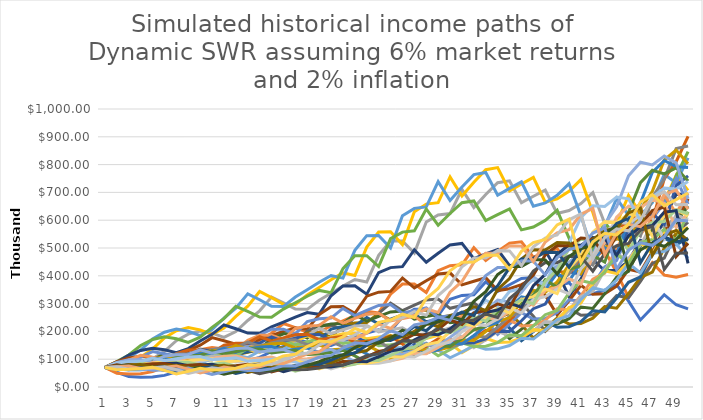
| Category | Series 0 | Series 1 | Series 2 | Series 3 | Series 4 | Series 5 | Series 6 | Series 7 | Series 8 | Series 9 | Series 10 | Series 11 | Series 12 | Series 13 | Series 14 | Series 15 | Series 16 | Series 17 | Series 18 | Series 19 | Series 20 | Series 21 | Series 22 | Series 23 | Series 24 | Series 25 | Series 26 | Series 27 | Series 28 | Series 29 | Series 30 | Series 31 | Series 32 | Series 33 | Series 34 | Series 35 | Series 36 | Series 37 | Series 38 | Series 39 |
|---|---|---|---|---|---|---|---|---|---|---|---|---|---|---|---|---|---|---|---|---|---|---|---|---|---|---|---|---|---|---|---|---|---|---|---|---|---|---|---|---|
| 0 | 70267.642 | 70267.642 | 70267.642 | 70267.642 | 70267.642 | 70267.642 | 70267.642 | 70267.642 | 70267.642 | 70267.642 | 70267.642 | 70267.642 | 70267.642 | 70267.642 | 70267.642 | 70267.642 | 70267.642 | 70267.642 | 70267.642 | 70267.642 | 70267.642 | 70267.642 | 70267.642 | 70267.642 | 70267.642 | 70267.642 | 70267.642 | 70267.642 | 70267.642 | 70267.642 | 70267.642 | 70267.642 | 70267.642 | 70267.642 | 70267.642 | 70267.642 | 70267.642 | 70267.642 | 70267.642 | 70267.642 |
| 1 | 53126.877 | 49607.112 | 66201.254 | 72033.815 | 81136.656 | 91250.923 | 88553.785 | 91304.866 | 80314.028 | 74380.325 | 67536.337 | 64791.999 | 78635.06 | 84204.65 | 80489.342 | 83024.652 | 65803.426 | 65088.684 | 70024.447 | 78554.146 | 75985.122 | 75735.637 | 74838.838 | 68689.363 | 88236.871 | 77906.833 | 70415.532 | 64529.028 | 86625.331 | 73402.612 | 70914.502 | 80219.629 | 63942.4 | 75465.923 | 74744.438 | 71096.559 | 62971.431 | 72930.613 | 72762.042 | 62148.804 |
| 2 | 37505.444 | 46735.429 | 67863.883 | 83174.384 | 105363.563 | 114995.402 | 115063.381 | 104356.958 | 85013.043 | 71487.754 | 62272.308 | 72505.956 | 94229.823 | 96451.844 | 95100.22 | 77748.434 | 60952.297 | 64862.138 | 78280.732 | 84944.205 | 81896.421 | 80660.962 | 73156.447 | 86253.291 | 97827.674 | 78069.265 | 64663.568 | 79549.254 | 90488.316 | 74076.875 | 80956.511 | 72997.109 | 68671.4 | 80272.326 | 75624.679 | 63713.025 | 65356.608 | 75518.059 | 64353.731 | 63453.22 |
| 3 | 35333.576 | 47908.185 | 78357.917 | 108007.505 | 132777.55 | 149417.502 | 131509.042 | 110460.386 | 81705.282 | 65914.369 | 69684.831 | 86883.404 | 107932.896 | 113957.961 | 89054.752 | 72015.207 | 60738.887 | 72508.253 | 84646.794 | 91550.581 | 87220.593 | 78846.053 | 91860.706 | 95626.507 | 98029.608 | 71690.612 | 79713.458 | 83094.963 | 91317.631 | 84564.945 | 73666.12 | 78394.144 | 73043.547 | 81215.983 | 67769.484 | 66124.92 | 67673.939 | 66789.88 | 65703.063 | 66293.666 |
| 4 | 36219.427 | 55315.188 | 101750.773 | 136106.427 | 172518.687 | 170769.557 | 139197.442 | 106160.175 | 75333.662 | 73758.809 | 83501.043 | 99515.969 | 127520.047 | 106711.382 | 82485.984 | 71761.493 | 67897.458 | 78403.161 | 91228.044 | 97500.246 | 85256.224 | 99002.835 | 101841.057 | 95821.8 | 90018.124 | 88374.052 | 83264.664 | 83854.684 | 104244.428 | 76947.919 | 79110.886 | 83383.491 | 73900.608 | 72778.422 | 70333.4 | 68467.994 | 59851.053 | 68188.8 | 68642.72 | 70601.941 |
| 5 | 41818.285 | 71827.243 | 128218.999 | 176839.832 | 197167.391 | 180749.064 | 133775.41 | 97879.229 | 84297.14 | 88380.714 | 95639.614 | 117572.94 | 119408.297 | 98837.96 | 82193.483 | 80217.314 | 73415.813 | 84497.02 | 97154.503 | 95302.159 | 107049.275 | 109756.618 | 102046.684 | 87988.717 | 110964.077 | 92308.951 | 84023.995 | 95722.826 | 94852.618 | 82633.339 | 84143.906 | 84359.926 | 66221.514 | 75530.096 | 72823.915 | 60551.92 | 61103.227 | 71238.027 | 73101.966 | 59729.407 |
| 6 | 54300.073 | 90509.311 | 166587.819 | 202100.989 | 208684.453 | 173704.27 | 123337.348 | 109522.588 | 101005.693 | 101226.173 | 112990.47 | 110091.254 | 110595.366 | 98485.069 | 91876.286 | 86734.846 | 79120.1 | 89984.014 | 94961.893 | 119660.215 | 118674.173 | 109975.543 | 93702.452 | 108459.808 | 115901.98 | 93148.488 | 95913.759 | 87096.636 | 101858.47 | 87888.311 | 85127.168 | 75592.148 | 68723.601 | 78202.718 | 64402.649 | 61817.248 | 63834.047 | 75864.021 | 61842.924 | 47148.711 |
| 7 | 68421.607 | 117590.682 | 190379.586 | 213900.714 | 200545.685 | 160146.554 | 138005.55 | 131227.695 | 115683.11 | 119587.451 | 105797.655 | 101963.335 | 110197.652 | 110084.261 | 99338.528 | 93471.588 | 84255.758 | 87950.959 | 119229.903 | 132651.16 | 118907.817 | 100980.371 | 115499.896 | 113283.347 | 116953.073 | 106326.663 | 87268.11 | 93527.213 | 108333.246 | 88913.034 | 76277.68 | 78446.266 | 71153.54 | 69157.669 | 65746.747 | 64578.312 | 67977.493 | 64177.915 | 48815.802 | 56628.32 |
| 8 | 88891.668 | 134381.097 | 201489.449 | 205552.895 | 184887.931 | 179187.489 | 165350.872 | 150292.649 | 136662.979 | 111971.624 | 97984.052 | 101593.888 | 123172.942 | 119022.113 | 107051.279 | 99536.077 | 82349.875 | 110424.271 | 132170.52 | 132908.69 | 109179.07 | 124467.433 | 120633.234 | 114307.57 | 133495.353 | 96739.755 | 93708.788 | 99469.684 | 109593.349 | 79667.805 | 79155.519 | 81217.762 | 62922.091 | 70599.077 | 68681.446 | 68768.189 | 57504.659 | 50657.546 | 58628.991 | 67023.189 |
| 9 | 101581.299 | 142218.975 | 193620.396 | 189498.716 | 206864.553 | 214686.657 | 189367.813 | 177544.041 | 127956.007 | 103699.046 | 97626.198 | 113552.836 | 133169.624 | 128259.408 | 113993.527 | 97281.734 | 103389.001 | 122405.628 | 132423.285 | 122030.894 | 134569.176 | 129995.567 | 121720.387 | 130471.884 | 121455.274 | 103876.465 | 99659.912 | 100623.777 | 98194.928 | 82671.156 | 81949.701 | 71819.948 | 64231.676 | 73748.232 | 73135.421 | 58171.854 | 45388.832 | 60839.212 | 69389.101 | 61486.293 |
| 10 | 107502.806 | 136660.503 | 178492.698 | 212016.891 | 247839.272 | 245861.995 | 223697.535 | 166227.385 | 118498.851 | 103317.15 | 109114.749 | 122764.987 | 143500.503 | 136572.807 | 111408.327 | 122131.974 | 114603.494 | 122635.955 | 121581.487 | 150405.138 | 140541.66 | 131163.07 | 138928.69 | 118700.853 | 130411.303 | 110469.914 | 100813.119 | 90155.484 | 101893.596 | 85586.813 | 72464.97 | 73312.473 | 67094.747 | 78528.377 | 61864.251 | 45914.045 | 54509.865 | 72002.752 | 63654.8 | 62126.99 |
| 11 | 103297.814 | 125979.019 | 199696.523 | 254003.889 | 283819.566 | 290423.861 | 209432.236 | 153936.601 | 118058.607 | 115471.646 | 117963.011 | 132284.399 | 152796.81 | 133471.197 | 139862.595 | 135375.088 | 114815.402 | 112591.802 | 149846.356 | 157075.343 | 141799.26 | 149701.464 | 126390.579 | 127449.623 | 138684.506 | 111744.569 | 90322.186 | 93548.287 | 105483.758 | 75678.664 | 73968.49 | 76577.819 | 71441.306 | 66423.916 | 48826.801 | 55138.827 | 64509.917 | 66050.308 | 64315.999 | 67671.564 |
| 12 | 95220.687 | 140939.669 | 239235.366 | 290869.073 | 335249.546 | 271893.985 | 193940.193 | 153359.393 | 131942.761 | 124831.078 | 127105.672 | 140849.227 | 149321.581 | 167554.64 | 155022.927 | 135620.711 | 105408.122 | 138761.978 | 156486.366 | 158475.408 | 161835.358 | 136186.414 | 135701.42 | 135530.25 | 140279.862 | 100112.611 | 93718.02 | 96841.057 | 93268.967 | 77246.191 | 77260.383 | 81535.893 | 60427.164 | 52423.735 | 58634.767 | 65252.006 | 59174.856 | 66734.081 | 70053.509 | 79577.047 |
| 13 | 106524.708 | 168838.755 | 273947.02 | 343563.827 | 313848.112 | 251772.279 | 193205.876 | 171388.75 | 142631.993 | 134501.096 | 135330.22 | 137640.67 | 187445.708 | 185709.802 | 155298.484 | 124504.188 | 129903.785 | 144905.482 | 157875.371 | 180861.174 | 147219.443 | 146213.506 | 144299.922 | 137084.275 | 125672.921 | 103872.712 | 97013.194 | 85623.921 | 95197.337 | 80680.985 | 82259.622 | 68962.926 | 47689.164 | 62951.91 | 69386.594 | 59853.37 | 59785.252 | 72684.629 | 82375.017 | 78550.544 |
| 14 | 127606.332 | 193328.695 | 323563.44 | 321619.027 | 290610.172 | 250809.161 | 215911.234 | 185266.405 | 153674.932 | 143198.562 | 132242.204 | 172775.707 | 207747.999 | 186032.615 | 142563.431 | 153431.548 | 135649.788 | 146185.963 | 180169.316 | 164520.522 | 158052.677 | 155471.996 | 145948.782 | 122805.269 | 130387.925 | 107520.716 | 85772.758 | 87390.802 | 99426.442 | 85898.192 | 69572.328 | 54423.461 | 57264.259 | 74492.45 | 63643.388 | 60468.396 | 65113.635 | 85465.567 | 81309.235 | 93847.329 |
| 15 | 146109.433 | 228334.236 | 302883.487 | 297793.267 | 289486.388 | 280272.286 | 233384.201 | 199601.869 | 163605.431 | 139925.156 | 165992.257 | 191481.084 | 208100.422 | 170770.112 | 175679.342 | 160211.554 | 136842.761 | 166822.248 | 163884.324 | 176619.486 | 168053.82 | 157241.945 | 130740.965 | 127407.359 | 134961.501 | 95058.853 | 87539.051 | 91269.29 | 105851.395 | 72646.668 | 54902.089 | 65347.946 | 67759.289 | 68323.771 | 64294.671 | 65854.912 | 76560.082 | 84356.274 | 97139.182 | 111236.111 |
| 16 | 172557.401 | 213731.143 | 280433.155 | 296628.469 | 323478.58 | 302940.257 | 251431.683 | 212490.692 | 159858.406 | 175628.167 | 183955.022 | 191797.353 | 191018.906 | 210428.734 | 183434.272 | 161613.323 | 156153.148 | 151736.889 | 175928.651 | 187787.106 | 169959.42 | 140851.098 | 135634.391 | 131870.503 | 119313.873 | 97012.044 | 91420.039 | 97162.79 | 89517.693 | 57325.606 | 65919.707 | 77321.053 | 62145.407 | 69019.87 | 70018.906 | 77428.214 | 75563.005 | 100774.947 | 115132.768 | 118109.511 |
| 17 | 161513.802 | 197879.519 | 279322.931 | 331443.486 | 349624.323 | 326350.901 | 267654.522 | 207614.149 | 200637.97 | 194624.39 | 184250.068 | 176045.642 | 235368.755 | 219707.106 | 185030.4 | 184410.376 | 142025.794 | 162880.693 | 187043.664 | 189907.404 | 152235.643 | 146115.957 | 140379.032 | 116575.686 | 121759.625 | 101308.176 | 97318.63 | 82165.887 | 70635.189 | 68826.286 | 77993.851 | 70911.591 | 62775.563 | 75161.209 | 82320.059 | 76416.184 | 90265.893 | 119436.304 | 122241.114 | 145599.577 |
| 18 | 149527.297 | 197086.049 | 312090.861 | 358214.699 | 376623.374 | 347389.913 | 261498.636 | 260562.792 | 222327.93 | 194926.587 | 169109.549 | 216907.985 | 245734.241 | 221607.53 | 211119.858 | 167717.987 | 152448.608 | 173162.498 | 189145.901 | 170094.711 | 157917.973 | 151219.527 | 124091.024 | 118959.23 | 127145.195 | 107839.257 | 82293.468 | 64830.83 | 84801.707 | 81428.649 | 71524.962 | 71626.976 | 68357.795 | 88361.262 | 81239.938 | 91280.417 | 106975.732 | 126803.871 | 150685.111 | 165333.306 |
| 19 | 148919.548 | 220194.534 | 337280.44 | 385855.969 | 400881.344 | 339381.555 | 328171.657 | 288715.094 | 222660.935 | 178898.929 | 208350.516 | 226448.055 | 247846.206 | 252840.535 | 191999.263 | 180016.398 | 162063.005 | 175099.121 | 169403.366 | 176433.973 | 163424.807 | 133666.381 | 126621.286 | 124214.124 | 135334.502 | 91184.801 | 64927.934 | 77828.965 | 100323.732 | 74670.781 | 72242.574 | 77992.031 | 80358.604 | 87197.094 | 97037.152 | 108172.132 | 113568.428 | 156300.996 | 171098.723 | 162171.971 |
| 20 | 166370.671 | 237952.925 | 363284.933 | 410684.403 | 391616.776 | 425886.905 | 363607.279 | 289130.497 | 204340.806 | 220398.483 | 217501.395 | 228380.808 | 282760.586 | 229927.854 | 206066.027 | 191358.123 | 163865.836 | 156813.51 | 175706.509 | 182575.728 | 144446.393 | 136383.852 | 132206.854 | 132206.854 | 114426.998 | 71938.783 | 77940.945 | 92069.281 | 91992.316 | 75415.511 | 78657.699 | 91678.813 | 79295.199 | 104146.547 | 114987.392 | 114831.793 | 139978.475 | 177464.947 | 167817.259 | 180569.567 |
| 21 | 179776.834 | 256282.955 | 386636.471 | 401167.827 | 491405.241 | 471843.775 | 364107.334 | 265324.54 | 251726.192 | 230063.918 | 219343.869 | 260536.543 | 257120.204 | 246757.788 | 219035.08 | 193474.565 | 146744.007 | 162637.891 | 181811.404 | 161363.092 | 147373.674 | 142391.034 | 140704.958 | 111775.44 | 90269.613 | 86351.446 | 92195.9 | 84418.002 | 92903.908 | 82107.183 | 92455.433 | 90459.865 | 94702.667 | 123404.076 | 122058.892 | 141526.652 | 158922.189 | 174050.343 | 186843.429 | 210547.317 |
| 22 | 193612.178 | 272737.855 | 377651.288 | 503355.547 | 544394.832 | 472460.337 | 334105.181 | 326829.305 | 262747.494 | 231996.927 | 250210.084 | 236895.19 | 275921.633 | 262269.877 | 221442.471 | 173247.151 | 152183.967 | 168277.199 | 160676.571 | 164621.928 | 153854.382 | 151533.391 | 118952.093 | 88171.806 | 108347.37 | 102137.64 | 84528.312 | 85248.701 | 101140.413 | 96503.4 | 91219.914 | 108029.289 | 112206.264 | 130984.218 | 150423.531 | 160668.886 | 155853.696 | 193769.918 | 217847.836 | 196206.387 |
| 23 | 206027.984 | 266379.88 | 473813.661 | 557592.487 | 545065.838 | 433497.887 | 411523.487 | 341113.582 | 264935.496 | 264624.095 | 227488.921 | 254198.882 | 293245.355 | 265132.826 | 198276.382 | 179656.308 | 157449.137 | 148704.652 | 163909.406 | 171848.398 | 163720.632 | 128096.975 | 93826.016 | 105821.612 | 128145.225 | 93636.301 | 85353.776 | 92799.653 | 118865.009 | 95206.737 | 108928.891 | 127986.527 | 119089.758 | 161411.016 | 170756.471 | 157555.001 | 173498.779 | 225906.965 | 202994.618 | 232603.879 |
| 24 | 201208.977 | 334182.088 | 524825.315 | 558234.952 | 500075.68 | 533904.451 | 429474.903 | 343926.563 | 302170.764 | 240574.709 | 244085.953 | 270137.059 | 296422.64 | 237377.04 | 205594.976 | 185857.032 | 139124.849 | 151684.434 | 171090.865 | 182853.876 | 138388.208 | 101031.129 | 112598.617 | 125147.9 | 117469.738 | 94543.121 | 92906.577 | 109053.799 | 117258.474 | 113680.571 | 129041.963 | 135827.188 | 146741.77 | 183214.443 | 167433.642 | 175378.621 | 202257.591 | 210487.367 | 240632.054 | 240676.653 |
| 25 | 252401.082 | 370128.456 | 525384.187 | 512113.126 | 615849.231 | 557145.743 | 432978.776 | 392229.384 | 274685.123 | 258103.929 | 259367.424 | 273040.147 | 265368.086 | 246117.408 | 212672.402 | 164212.241 | 141900.288 | 158316.46 | 182031.948 | 154547.49 | 109138.386 | 121234.743 | 133150.979 | 114712.105 | 118597.025 | 102900.093 | 109169.928 | 107570.483 | 139998.994 | 134659.264 | 136935.335 | 167350.942 | 166549.143 | 179633.516 | 186358.538 | 204431.197 | 188435.774 | 249492.274 | 248961.734 | 261904.699 |
| 26 | 279524.076 | 370487.362 | 481930.686 | 630613.518 | 642596.533 | 561637.808 | 493741.594 | 356518.049 | 294671.738 | 274236.942 | 262129.845 | 244412.003 | 275112.938 | 254565.573 | 187886.842 | 167472.229 | 148090.444 | 168424.617 | 153838.169 | 121870.642 | 130950.789 | 143349.804 | 122036.22 | 115801.916 | 129067.926 | 120901.317 | 107674.792 | 128419.95 | 165818.738 | 142882.652 | 168700.232 | 189922.102 | 163278.411 | 199918.342 | 217209.349 | 190442.73 | 223333.114 | 258104.112 | 270894.774 | 249807.608 |
| 27 | 279766.034 | 339809.74 | 593385.311 | 657933.641 | 647710.204 | 640389.62 | 448741.208 | 382419.218 | 313057.901 | 277128.915 | 234621.244 | 253360.96 | 284526.81 | 224874.259 | 191596.902 | 174759.744 | 157529.311 | 142323.592 | 121298.683 | 146212.51 | 154822.105 | 131370.039 | 123182.804 | 126012.934 | 151631.152 | 119233.116 | 128531.111 | 152088.379 | 175926.682 | 176008.846 | 191433.469 | 186173.007 | 181697.469 | 232989.689 | 202325.482 | 225688.28 | 231017.982 | 280813.377 | 258355.577 | 318233.929 |
| 28 | 256571.176 | 418348.762 | 619021.969 | 663093.71 | 738446.679 | 581957.106 | 481287.514 | 406234.074 | 316323.172 | 248017.976 | 243183.975 | 262000.626 | 251312.287 | 229288.521 | 199911.389 | 185877.231 | 133101.563 | 112206.841 | 145509.71 | 172846.2 | 141867.413 | 132589.191 | 134029.351 | 148025.208 | 149521.88 | 142312.014 | 152202.662 | 161340.943 | 216689.148 | 199704.173 | 187633.133 | 207151.118 | 211730.486 | 216999.746 | 239742.84 | 233427.557 | 251315.404 | 267784.515 | 329085.778 | 354336.731 |
| 29 | 315831.881 | 436368.303 | 623798.484 | 755890.259 | 670982.62 | 624086.884 | 511195.087 | 410419.63 | 283059.517 | 257037.338 | 251445.011 | 231386.648 | 256213.335 | 239208.609 | 212602.206 | 157033.899 | 104923.08 | 134586.24 | 171993.769 | 158363.45 | 143165.996 | 144245.871 | 157422.176 | 145947.76 | 178441.087 | 168500.421 | 161441.896 | 198698.907 | 245830.205 | 195715.057 | 208749.543 | 241361.077 | 197174.775 | 257098.608 | 247932.923 | 253904.785 | 239625.049 | 341053.234 | 366373.662 | 418387.789 |
| 30 | 329389.948 | 439674.334 | 710997.085 | 686737.152 | 719457.288 | 662776.036 | 516390.344 | 367210.037 | 293312.441 | 265732.059 | 222033.577 | 235866.339 | 267261.183 | 254358.761 | 179586.899 | 123771.586 | 125832.267 | 159060.032 | 157560.554 | 159790.828 | 155730.907 | 169398.301 | 155191.285 | 174151.496 | 211248.654 | 178704.157 | 198795.615 | 225389.264 | 240886.248 | 217710.767 | 243189.686 | 224737.146 | 233577.776 | 265844.663 | 269645.159 | 242060.349 | 305146.639 | 379644.373 | 432540.46 | 449175.089 |
| 31 | 331834.271 | 501057.536 | 645851.381 | 736236.368 | 763940.853 | 669408.49 | 461952.7 | 380452.326 | 303187.435 | 234613.264 | 226297.265 | 245998.864 | 284144.176 | 214825.862 | 141525.654 | 148414.018 | 148691.247 | 145689.692 | 158956.163 | 173787.989 | 182857.783 | 166971.922 | 185152.715 | 206138.579 | 224006.486 | 220017.986 | 225464.164 | 220822.319 | 267917.235 | 253590.222 | 226404.866 | 266187.712 | 241486.423 | 289080.868 | 257026.78 | 308200.267 | 339622.43 | 448138.687 | 464297.534 | 449238.305 |
| 32 | 378096.705 | 455069.304 | 692284.308 | 781622.688 | 771452.74 | 598736.57 | 478529.132 | 393193.319 | 267636.277 | 239077.322 | 235978.051 | 261493.649 | 239940.629 | 169266.983 | 169673.614 | 175345.037 | 136169.028 | 146954.832 | 172850.426 | 204025.086 | 180207.565 | 199173.416 | 219122.676 | 218550.142 | 275746.047 | 249490.539 | 220857.645 | 245559.525 | 312017.118 | 236046.888 | 268116.826 | 275153.077 | 262548.351 | 275505.498 | 327199.703 | 342961.962 | 400827.035 | 480958.107 | 464282.876 | 474996.104 |
| 33 | 343327.681 | 487691.764 | 734818.976 | 789155.763 | 689874.162 | 620101.299 | 494458.961 | 347021.11 | 272675.919 | 249256.603 | 250793.132 | 220771.071 | 189019.003 | 202893.147 | 200423.596 | 160547.074 | 137324.923 | 159769.155 | 202885.144 | 201029.19 | 214920.048 | 235670.16 | 232271.071 | 268977.392 | 312623.179 | 244345.856 | 245551.301 | 285923.951 | 290375.641 | 279481.186 | 277093.555 | 299093.471 | 250170.559 | 350655.601 | 364033.902 | 404690.101 | 430098.376 | 480849.892 | 490808.322 | 473888.602 |
| 34 | 367859.324 | 517542.912 | 741738.815 | 705550.906 | 714334.793 | 640603.902 | 436299.872 | 353478.309 | 284223.605 | 264847.434 | 211690.674 | 173879.71 | 226519.535 | 239611.129 | 183469.059 | 161874.519 | 149266.896 | 187489.867 | 199862.294 | 239700.036 | 254246.639 | 249756.882 | 285801.745 | 304882.661 | 306109.734 | 271606.306 | 285851.885 | 266034.135 | 343731.67 | 288775.272 | 301136.954 | 284930.477 | 318340.414 | 390045.056 | 429460.796 | 434148.641 | 429907.621 | 508210.744 | 489556.929 | 422368.178 |
| 35 | 390278.542 | 522286.705 | 662992.462 | 730385.666 | 737769.514 | 565114.403 | 444307.784 | 368356.29 | 301926.48 | 223498.092 | 166686.502 | 208324.843 | 267446.692 | 219287.024 | 184940.017 | 175907.594 | 175121.846 | 184650.456 | 238249.397 | 283490.399 | 269376.714 | 307241.007 | 323872.286 | 298456.234 | 340176.238 | 316104.467 | 265900.927 | 314839.124 | 355074.05 | 313754.232 | 286805.839 | 362482.002 | 354011.799 | 460032.416 | 460607.868 | 433848.15 | 454256.789 | 506788.894 | 436224.538 | 488130.043 |
| 36 | 393743.431 | 466705.153 | 686133.334 | 754131.677 | 650644.17 | 575322.361 | 462876.662 | 391187.7 | 254715.453 | 175933.51 | 199649.685 | 245894.42 | 244691.69 | 220982.068 | 200915.311 | 206318.16 | 172420.52 | 220053.036 | 281694.33 | 300275.035 | 331281.976 | 348068.027 | 316955.109 | 331576.337 | 395795.451 | 293958.123 | 314591.673 | 325135.299 | 385677.733 | 298737.38 | 364763.665 | 402984.599 | 417414.408 | 493255.916 | 460157.704 | 458289.676 | 452856.613 | 451450.377 | 503999.935 | 519225.955 |
| 37 | 351725.115 | 482835.238 | 708206.478 | 664854.258 | 662178.162 | 599168.605 | 491404.149 | 329910.179 | 200440.96 | 210655.691 | 235576.884 | 224898.779 | 246501.607 | 239991.36 | 235571.276 | 203068.478 | 205410.371 | 260093.857 | 298274.008 | 369158.963 | 375179.581 | 340521.498 | 352011.673 | 385661.946 | 367944.287 | 347671.642 | 324772.376 | 353041.848 | 367097.119 | 379812.789 | 405387.176 | 475001.062 | 447412.112 | 492610.974 | 485920.761 | 456726.063 | 403273.866 | 521418.988 | 535929.631 | 530516.201 |
| 38 | 363740.494 | 498175.361 | 624124.277 | 676378.316 | 689357.587 | 635849.735 | 414267.872 | 259512.814 | 239907.053 | 248467.249 | 215378.827 | 226474.621 | 267602.544 | 281278.681 | 231771.111 | 241828.699 | 242692.864 | 275295.625 | 366556.995 | 417913.801 | 366903.206 | 378038.258 | 409272.188 | 358385.115 | 435008.536 | 358783.977 | 352511.313 | 335903.483 | 466544.315 | 421948.969 | 477648.093 | 508940.243 | 446654.205 | 519989.71 | 484075.481 | 406562.267 | 465595.54 | 554237.672 | 547371.192 | 583182.893 |
| 39 | 375124.661 | 438827.77 | 634651.009 | 703817.497 | 731224.412 | 535793.704 | 325720.447 | 310467.414 | 282839.231 | 227059.753 | 216788.444 | 245748.402 | 313496.088 | 276614.195 | 275883.232 | 285590.106 | 256759.723 | 338163.001 | 414777.782 | 408507.189 | 407139.654 | 439330.747 | 380150.956 | 423512.62 | 448706.361 | 389249.168 | 335244.805 | 426704.39 | 518064.609 | 496933.928 | 511541.576 | 507844.974 | 471262.379 | 517777.362 | 430710.082 | 469176.747 | 494673.549 | 565810.349 | 601435.057 | 603831.657 |
| 40 | 330253.568 | 445982.734 | 660032.623 | 746150.141 | 615820.068 | 421038.12 | 389459.484 | 365824.426 | 258327.536 | 228419.579 | 235107.96 | 287734.961 | 308127.042 | 329079.258 | 325627.194 | 301976.463 | 315219.969 | 382437.179 | 405217.804 | 453055.746 | 472889.088 | 407845.332 | 448985.713 | 436607.154 | 486538.177 | 369978.71 | 425632.423 | 473563.452 | 609793.356 | 531901.949 | 510158.759 | 535528.449 | 468998.144 | 460442.13 | 496769.006 | 498203.071 | 504723.559 | 621352.046 | 622386.101 | 448145.677 |
| 41 | 335410.982 | 463504.857 | 699257.905 | 627964.651 | 483596.854 | 503088.624 | 458590.207 | 333894.735 | 259698.645 | 247554.228 | 275090.176 | 282615.606 | 366320.884 | 388151.875 | 344077.615 | 370480.823 | 356248.919 | 373369.602 | 449103.33 | 525863.89 | 438701.386 | 481368.59 | 462554.415 | 473098.272 | 462138.108 | 469413.092 | 472053.897 | 557035.351 | 652261.039 | 530104.889 | 537604.076 | 532594.549 | 416781.983 | 530701.512 | 527145.167 | 507980.575 | 553893.463 | 642561.492 | 461603.439 | 522731.352 |
| 42 | 348292.96 | 490633.781 | 588000.278 | 492715.246 | 577348.072 | 591886.131 | 418208.467 | 335381.982 | 281214.61 | 289407.16 | 269966.429 | 335706.058 | 431711.911 | 409796.849 | 421774.416 | 418347.079 | 347507.019 | 413454.657 | 520833.795 | 487432.225 | 517347.593 | 495494.949 | 500788.698 | 448990.75 | 585843.236 | 520167.55 | 554788.361 | 595323.027 | 649505.51 | 558149.049 | 534204.936 | 472896.069 | 479971.424 | 562674.504 | 537034.404 | 556994.546 | 572314.009 | 476162.314 | 537971.845 | 553077.532 |
| 43 | 368275.011 | 412118.388 | 460853.333 | 587590.347 | 678509.269 | 539176.068 | 419611.494 | 362770.799 | 328398.527 | 283705.889 | 320329.693 | 395199.084 | 455287.112 | 501784.021 | 475746.541 | 407634.717 | 384394.275 | 478966.531 | 482241.346 | 574185.291 | 531946.94 | 535864.909 | 474749.974 | 568553.623 | 648475.954 | 610665.534 | 592272.631 | 592159.201 | 683117.824 | 554012.969 | 473806.792 | 543997.054 | 508331.113 | 572602.863 | 588207.212 | 574888.311 | 423642.088 | 554331.975 | 568579.783 | 547187.568 |
| 44 | 308887.799 | 322530.768 | 548788.929 | 689535.57 | 617180.485 | 540193.208 | 453214.637 | 423018.733 | 321457.999 | 336139.65 | 376545.885 | 416170.422 | 556669.626 | 565166.213 | 462885.972 | 450244.536 | 444649.846 | 442827.324 | 567239.186 | 589524.558 | 574444.874 | 507258.935 | 600292.536 | 628416.883 | 760182.708 | 650971.07 | 588262.848 | 621892.353 | 677063.367 | 490656.18 | 544247.049 | 575296.61 | 516543.531 | 626247.071 | 606215.222 | 424924.878 | 492467.945 | 585013.319 | 561701.49 | 585958.083 |
| 45 | 241244.023 | 383283.752 | 642678.86 | 625921.293 | 617074.142 | 582253.786 | 527397.245 | 413227.568 | 380086.357 | 394318.454 | 395712.564 | 507796.883 | 625696.232 | 548758.452 | 510220.562 | 519752.202 | 410255.149 | 519807.862 | 581196.131 | 635314.249 | 542661.982 | 640080.137 | 662134.18 | 735154.474 | 808691.571 | 645235.266 | 616530.841 | 615113.936 | 598402.377 | 562443.271 | 574378.269 | 583389.624 | 563774.944 | 644093.403 | 447159.198 | 492944.104 | 518657.236 | 576748.623 | 600264.354 | 665625.36 |
| 46 | 285798.986 | 447470.021 | 581583.301 | 623878.114 | 663063.943 | 675462.297 | 513596.914 | 487082.126 | 444492.565 | 413108.278 | 481341.737 | 568998.219 | 605652.387 | 603003.761 | 587165.738 | 478065.159 | 480084.114 | 530950.696 | 624401.979 | 598307.568 | 682635.553 | 703837.296 | 772203.258 | 779647.69 | 799087.222 | 674149.697 | 607925.021 | 541968.969 | 683832.32 | 591746.237 | 580657.11 | 634764.172 | 578047.83 | 473629.826 | 517133.352 | 517553.217 | 509748.687 | 614438.48 | 679768.016 | 691799.865 |
| 47 | 331933.279 | 402836.148 | 576684.832 | 666905.641 | 765227.871 | 654383.345 | 602257.043 | 566671.003 | 463263.275 | 499901.173 | 536563.311 | 547920.282 | 662077.469 | 690350.028 | 537276.739 | 556540.746 | 487837.592 | 567469.243 | 584987.717 | 748739.214 | 746746.861 | 816590.786 | 814700.529 | 766401.318 | 830575.297 | 661299.405 | 532862.858 | 616137.031 | 715736.194 | 595119.018 | 628521.344 | 647466.03 | 422863.836 | 544911.533 | 540140.149 | 506031.164 | 540249.698 | 692218.426 | 702842.34 | 651713.507 |
| 48 | 295712.496 | 395284.174 | 610038.944 | 761647.726 | 733628.672 | 759357.193 | 693370.047 | 584451.87 | 554756.657 | 551449.821 | 511307.114 | 592730.321 | 750088.532 | 625116.656 | 618959.597 | 559640.691 | 515962.083 | 526113.197 | 724448.007 | 810530.707 | 857353.64 | 852560.555 | 792520.01 | 788307.137 | 806260.141 | 573611.639 | 599477.284 | 638168.052 | 712320.913 | 637468.167 | 634423.123 | 468714.24 | 481439.692 | 563228.086 | 522616.483 | 530725.643 | 602301.123 | 708263.297 | 655222.129 | 674045.117 |
| 49 | 281005.118 | 404941.25 | 674700.264 | 707136.455 | 824429.893 | 846628.454 | 692542.45 | 677777.211 | 592635.86 | 508897.622 | 535654.999 | 650315.973 | 657760.531 | 697411.161 | 602751.334 | 573212.126 | 463252.974 | 630962.038 | 759468.343 | 901196.764 | 866850.724 | 803158.081 | 789428.883 | 741063.116 | 677264.908 | 624940.682 | 601303.926 | 615065.454 | 738914.057 | 623133.408 | 444768.196 | 516788.756 | 481907.579 | 527745.461 | 530810.459 | 572997.56 | 596800 | 639424.007 | 656272.735 | 697688.89 |